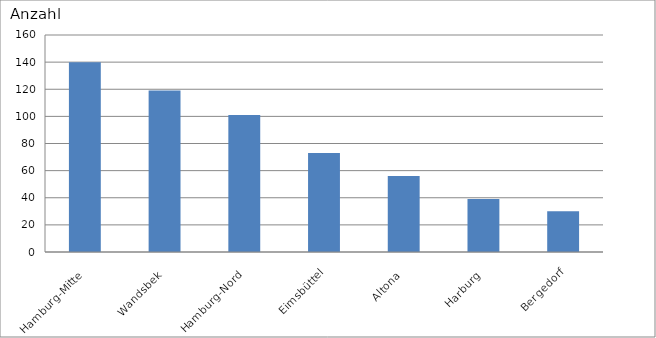
| Category | Hamburg-Mitte |
|---|---|
| Hamburg-Mitte | 140 |
| Wandsbek | 119 |
| Hamburg-Nord | 101 |
| Eimsbüttel | 73 |
| Altona | 56 |
| Harburg | 39 |
| Bergedorf | 30 |